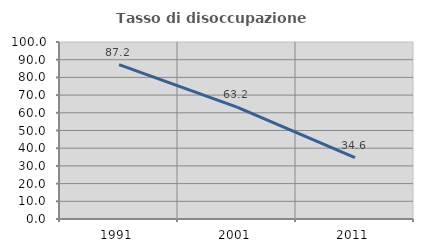
| Category | Tasso di disoccupazione giovanile  |
|---|---|
| 1991.0 | 87.248 |
| 2001.0 | 63.235 |
| 2011.0 | 34.615 |